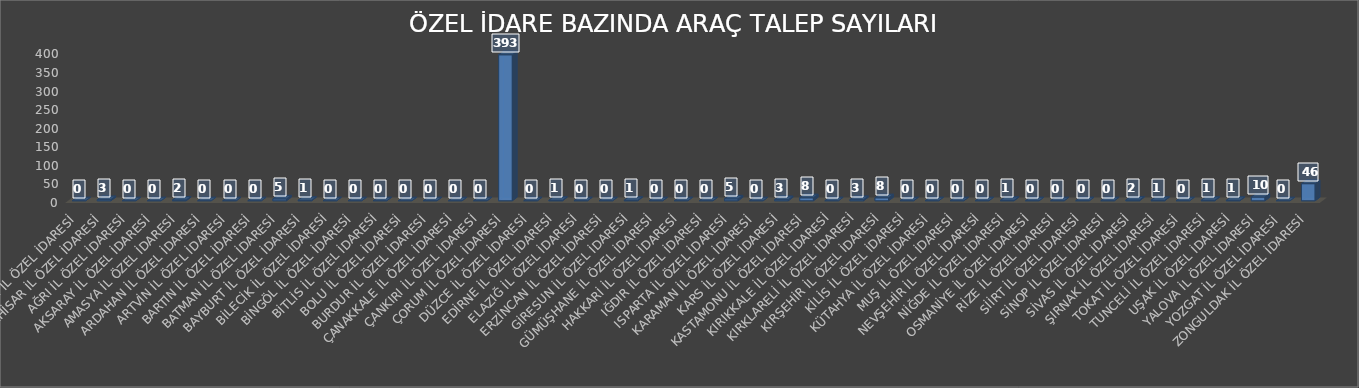
| Category | Series 0 |
|---|---|
| ADIYAMAN İL ÖZEL İDARESİ | 0 |
| AFYONKARAHİSAR İL ÖZEL İDARESİ | 3 |
| AĞRI İL ÖZEL İDARESİ | 0 |
| AKSARAY İL ÖZEL İDARESİ | 0 |
| AMASYA İL ÖZEL İDARESİ | 2 |
| ARDAHAN İL ÖZEL İDARESİ | 0 |
| ARTVİN İL ÖZEL İDARESİ | 0 |
| BARTIN İL ÖZEL İDARESİ | 0 |
| BATMAN İL ÖZEL İDARESİ | 5 |
| BAYBURT İL ÖZEL İDARESİ | 1 |
| BİLECİK İL ÖZEL İDARESİ | 0 |
| BİNGÖL İL ÖZEL İDARESİ | 0 |
| BİTLİS İL ÖZEL İDARESİ | 0 |
| BOLU İL ÖZEL İDARESİ | 0 |
| BURDUR İL ÖZEL İDARESİ | 0 |
| ÇANAKKALE İL ÖZEL İDARESİ | 0 |
| ÇANKIRI İL ÖZEL İDARESİ | 0 |
| ÇORUM İL ÖZEL İDARESİ | 393 |
| DÜZCE İL ÖZEL İDARESİ | 0 |
| EDİRNE İL ÖZEL İDARESİ | 1 |
| ELAZIĞ İL ÖZEL İDARESİ | 0 |
| ERZİNCAN İL ÖZEL İDARESİ | 0 |
| GİRESUN İL ÖZEL İDARESİ | 1 |
| GÜMÜŞHANE İL ÖZEL İDARESİ | 0 |
| HAKKARİ İL ÖZEL İDARESİ | 0 |
| IĞDIR İL ÖZEL İDARESİ | 0 |
| ISPARTA İL ÖZEL İDARESİ | 5 |
| KARAMAN İL ÖZEL İDARESİ | 0 |
| KARS İL ÖZEL İDARESİ | 3 |
| KASTAMONU İL ÖZEL İDARESİ | 8 |
| KIRIKKALE İL ÖZEL İDARESİ | 0 |
| KIRKLARELİ İL ÖZEL İDARESİ | 3 |
| KIRŞEHİR İL ÖZEL İDARESİ | 8 |
| KİLİS İL ÖZEL İDARESİ | 0 |
| KÜTAHYA İL ÖZEL İDARESİ | 0 |
| MUŞ İL ÖZEL İDARESİ | 0 |
| NEVŞEHİR İL ÖZEL İDARESİ | 0 |
| NİĞDE İL ÖZEL İDARESİ | 1 |
| OSMANİYE İL ÖZEL İDARESİ | 0 |
| RİZE İL ÖZEL İDARESİ | 0 |
| SİİRT İL ÖZEL İDARESİ | 0 |
| SİNOP İL ÖZEL İDARESİ | 0 |
| SİVAS İL ÖZEL İDARESİ | 2 |
| ŞIRNAK İL ÖZEL İDARESİ | 1 |
| TOKAT İL ÖZEL İDARESİ | 0 |
| TUNCELİ İL ÖZEL İDARESİ | 1 |
| UŞAK İL ÖZEL İDARESİ | 1 |
| YALOVA İL ÖZEL İDARESİ | 10 |
| YOZGAT İL ÖZEL İDARESİ | 0 |
| ZONGULDAK İL ÖZEL İDARESİ | 46 |